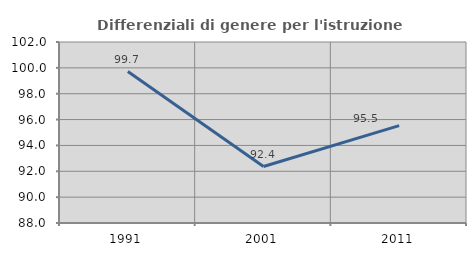
| Category | Differenziali di genere per l'istruzione superiore |
|---|---|
| 1991.0 | 99.717 |
| 2001.0 | 92.369 |
| 2011.0 | 95.53 |